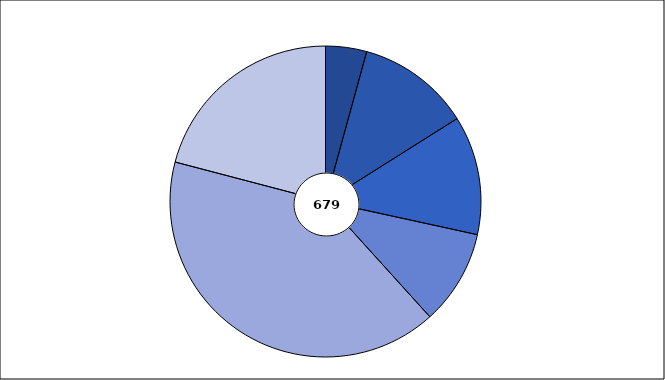
| Category | Series 1 |
|---|---|
| 0 | 29 |
| 1 | 80 |
| 2 | 84 |
| 3 | 67 |
| 4 | 277 |
| 5 | 142 |